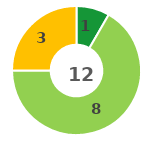
| Category | Series 0 |
|---|---|
| 0 | 1 |
| 1 | 8 |
| 2 | 3 |
| 3 | 0 |
| 4 | 0 |